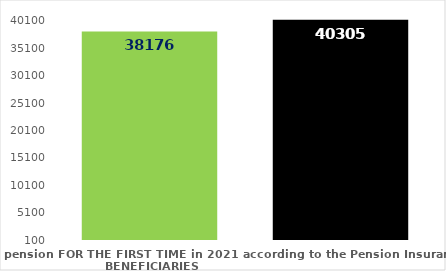
| Category | broj korisnika |
|---|---|
| Pension beneficiaries entitled to pension FOR THE FIRST TIME in 2021 according to the Pension Insurance Act  - NEW BENEFICIARIES | 38176 |
| Pension beneficiaries whose pension entitlement ceased in 2021  -  death caused,   
and who were retired according to the Pension Insurance Act   | 40305 |